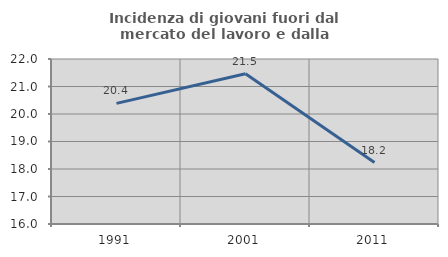
| Category | Incidenza di giovani fuori dal mercato del lavoro e dalla formazione  |
|---|---|
| 1991.0 | 20.386 |
| 2001.0 | 21.466 |
| 2011.0 | 18.233 |